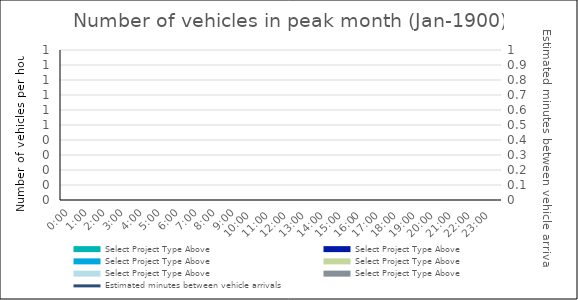
| Category | Select Project Type Above |
|---|---|
| 00:00 | 0 |
| 01:00 | 0 |
| 02:00 | 0 |
| 03:00 | 0 |
| 04:00 | 0 |
| 05:00 | 0 |
| 06:00 | 0 |
| 07:00 | 0 |
| 08:00 | 0 |
| 09:00 | 0 |
| 10:00 | 0 |
| 11:00 | 0 |
| 12:00 | 0 |
| 13:00 | 0 |
| 14:00 | 0 |
| 15:00 | 0 |
| 16:00 | 0 |
| 17:00 | 0 |
| 18:00 | 0 |
| 19:00 | 0 |
| 20:00 | 0 |
| 21:00 | 0 |
| 22:00 | 0 |
| 23:00 | 0 |